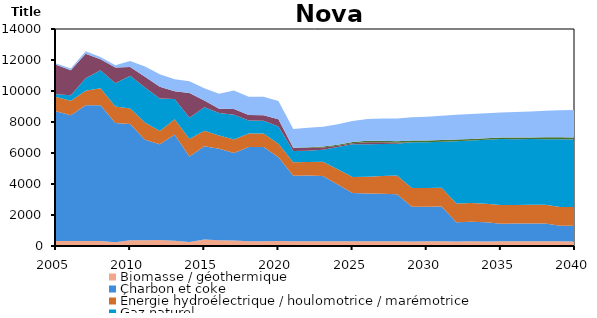
| Category | Biomasse / géothermique | Charbon et coke | Énergie hydroélectrique / houlomotrice / marémotrice | Gaz naturel | Pétrole | Solaire | Uranium | Éolien |
|---|---|---|---|---|---|---|---|---|
| 2005.0 | 318 | 8374.984 | 926.065 | 165.12 | 1911.496 | 0 | 0 | 85 |
| 2006.0 | 318 | 8119.944 | 926.065 | 354.872 | 1624.086 | 0 | 0 | 110 |
| 2007.0 | 318 | 8768.63 | 926.065 | 804.62 | 1586.952 | 0 | 0 | 157 |
| 2008.0 | 322 | 8765.973 | 1096.663 | 1158.914 | 708.159 | 0 | 0 | 149 |
| 2009.0 | 245 | 7688.15 | 1074.14 | 1489.508 | 1014.587 | 0 | 0 | 154 |
| 2010.0 | 378 | 7492.966 | 1007.811 | 2111.399 | 563.73 | 0 | 0 | 387 |
| 2011.0 | 363 | 6494.95 | 1112.474 | 2260.781 | 693.239 | 0 | 0 | 664.188 |
| 2012.0 | 387 | 6173.748 | 851.497 | 2103.871 | 762.457 | 0 | 0 | 800 |
| 2013.0 | 331 | 6848.48 | 1005.758 | 1291.846 | 512.589 | 0 | 0 | 765 |
| 2014.0 | 253.9 | 5521.816 | 1128.686 | 1363.723 | 1608.56 | 0 | 0 | 748.678 |
| 2015.0 | 413.5 | 6025.074 | 990.309 | 1526.144 | 425.383 | 0 | 0 | 800.794 |
| 2016.0 | 376.366 | 5896.869 | 852.816 | 1447.441 | 287.323 | 0 | 0 | 957.906 |
| 2017.0 | 357.468 | 5640.661 | 874.376 | 1589.127 | 382.544 | 0 | 0 | 1182.616 |
| 2018.0 | 306.321 | 6078.145 | 874.358 | 831.89 | 362.689 | 0 | 0 | 1182.604 |
| 2019.0 | 306.328 | 6078.119 | 874.382 | 820.37 | 361.581 | 0 | 0 | 1182.618 |
| 2020.0 | 324.306 | 5400.488 | 874.363 | 1109.197 | 467.982 | 0 | 0 | 1182.607 |
| 2021.0 | 306.329 | 4224.854 | 874.385 | 719.629 | 195.235 | 16.962 | 0 | 1217.662 |
| 2022.0 | 306.324 | 4241.399 | 874.368 | 719.629 | 197.894 | 33.517 | 0 | 1252.688 |
| 2023.0 | 308.944 | 4200.652 | 927.731 | 766.178 | 157.849 | 50.246 | 0 | 1287.74 |
| 2024.0 | 309.349 | 3662.341 | 981.33 | 1431.938 | 80.23 | 68.032 | 0 | 1322.768 |
| 2025.0 | 308.092 | 3110.015 | 1035.127 | 2117.469 | 53.882 | 85.978 | 0 | 1357.822 |
| 2026.0 | 310.752 | 3072.406 | 1092.227 | 2083.761 | 131.991 | 104.072 | 0 | 1392.845 |
| 2027.0 | 310.36 | 3063.702 | 1149.954 | 2061.236 | 103.65 | 104.071 | 0 | 1427.883 |
| 2028.0 | 309.866 | 3036.273 | 1208.138 | 2036.909 | 63.024 | 104.074 | 0 | 1462.942 |
| 2029.0 | 296.78 | 2230.964 | 1208.143 | 2957.071 | 8.574 | 104.075 | 0 | 1497.989 |
| 2030.0 | 308.198 | 2225.027 | 1208.129 | 2951.413 | 8.717 | 104.073 | 0 | 1533.011 |
| 2031.0 | 308.492 | 2242.023 | 1208.133 | 2960.781 | 9.368 | 104.074 | 0 | 1568.058 |
| 2032.0 | 295.828 | 1240.315 | 1208.141 | 4012.713 | 3.413 | 104.075 | 0 | 1603.108 |
| 2033.0 | 309.366 | 1260.856 | 1208.132 | 4024.262 | 3.487 | 104.073 | 0 | 1603.097 |
| 2034.0 | 297.05 | 1227.714 | 1208.138 | 4118.497 | 3.348 | 104.074 | 0 | 1603.105 |
| 2035.0 | 298.616 | 1141.852 | 1208.137 | 4248.903 | 3.157 | 104.074 | 0 | 1603.103 |
| 2036.0 | 298.713 | 1145.148 | 1208.134 | 4242.656 | 3.171 | 104.074 | 0 | 1638.137 |
| 2037.0 | 298.798 | 1148.911 | 1208.138 | 4241.693 | 3.184 | 104.075 | 0 | 1673.188 |
| 2038.0 | 298.935 | 1153.615 | 1208.125 | 4228.035 | 3.205 | 121.85 | 0 | 1708.201 |
| 2039.0 | 299.79 | 1003.344 | 1208.128 | 4372.95 | 2.663 | 121.851 | 0 | 1743.248 |
| 2040.0 | 289.508 | 1015.218 | 1208.137 | 4365.298 | 2.709 | 121.853 | 0 | 1778.304 |